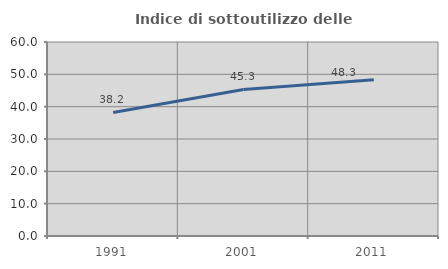
| Category | Indice di sottoutilizzo delle abitazioni  |
|---|---|
| 1991.0 | 38.205 |
| 2001.0 | 45.333 |
| 2011.0 | 48.35 |